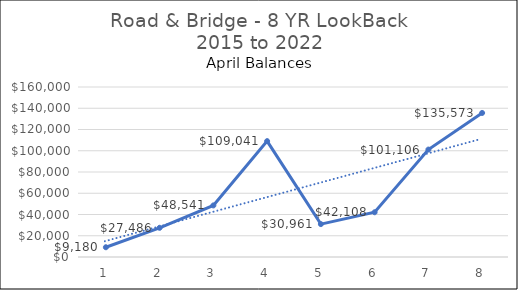
| Category | Roads |
|---|---|
| 0 | 9180.14 |
| 1 | 27486.05 |
| 2 | 48541.1 |
| 3 | 109040.67 |
| 4 | 30961.35 |
| 5 | 42108 |
| 6 | 101106.36 |
| 7 | 135572.95 |